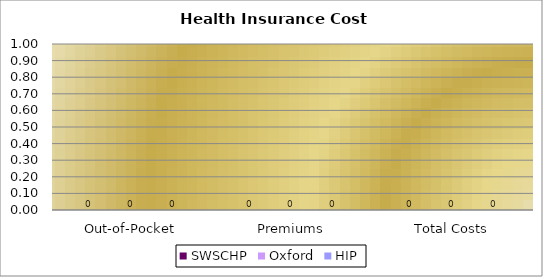
| Category | SWSCHP | Oxford | HIP |
|---|---|---|---|
| 0 | 0 | 0 | 0 |
| 1 | 0 | 0 | 0 |
| 2 | 0 | 0 | 0 |